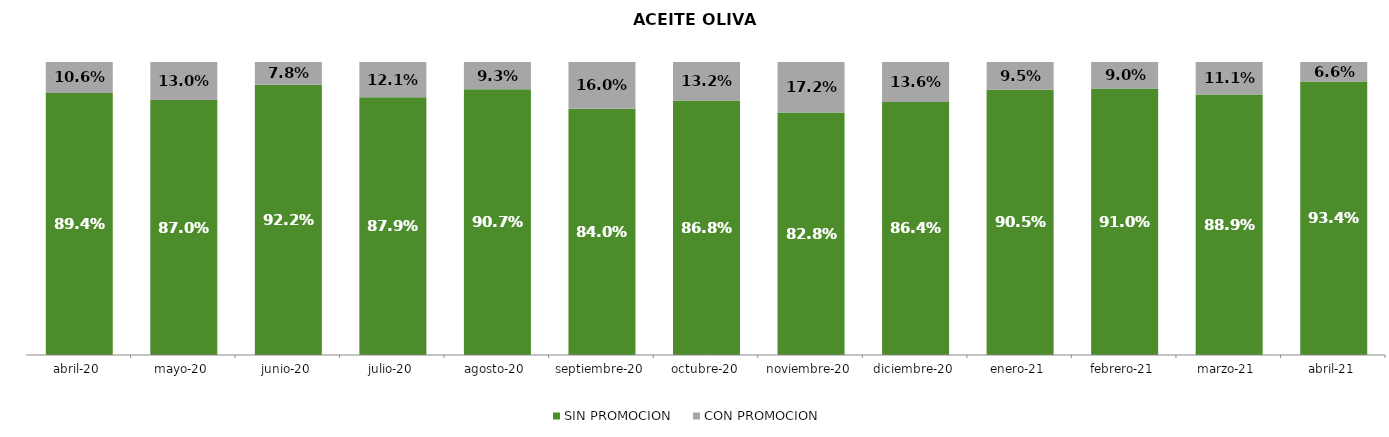
| Category | SIN PROMOCION   | CON PROMOCION   |
|---|---|---|
| 2020-04-01 | 0.894 | 0.106 |
| 2020-05-01 | 0.87 | 0.13 |
| 2020-06-01 | 0.922 | 0.078 |
| 2020-07-01 | 0.879 | 0.121 |
| 2020-08-01 | 0.907 | 0.093 |
| 2020-09-01 | 0.84 | 0.16 |
| 2020-10-01 | 0.868 | 0.132 |
| 2020-11-01 | 0.828 | 0.172 |
| 2020-12-01 | 0.864 | 0.136 |
| 2021-01-01 | 0.905 | 0.095 |
| 2021-02-01 | 0.91 | 0.09 |
| 2021-03-01 | 0.889 | 0.111 |
| 2021-04-01 | 0.934 | 0.066 |